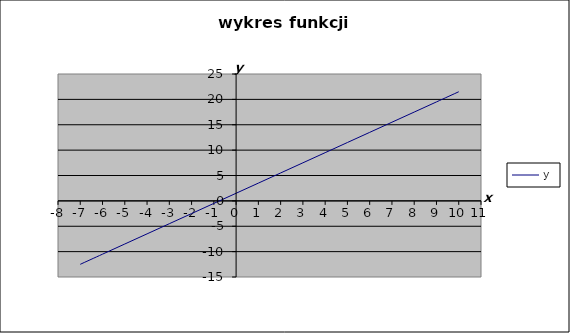
| Category | y |
|---|---|
| -7.0 | -12.5 |
| -6.0 | -10.5 |
| -5.0 | -8.5 |
| -4.0 | -6.5 |
| -3.0 | -4.5 |
| -2.0 | -2.5 |
| -1.0 | -0.5 |
| 0.0 | 1.5 |
| 1.0 | 3.5 |
| 2.0 | 5.5 |
| 3.0 | 7.5 |
| 4.0 | 9.5 |
| 5.0 | 11.5 |
| 6.0 | 13.5 |
| 7.0 | 15.5 |
| 8.0 | 17.5 |
| 9.0 | 19.5 |
| 10.0 | 21.5 |